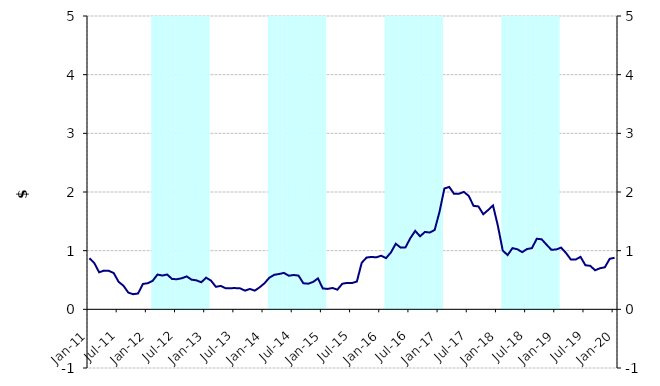
| Category | Series 1 |
|---|---|
| 0 | 0 |
| 1900-01-01 | 0 |
| 1900-01-02 | 0 |
| 1900-01-03 | 0 |
| 1900-01-04 | 0 |
| 1900-01-05 | 0 |
| 1900-01-06 | 0 |
| 1900-01-07 | 0 |
| 1900-01-08 | 0 |
| 1900-01-09 | 0 |
| 1900-01-10 | 0 |
| 1900-01-11 | 0 |
| 1900-01-12 | 0 |
| 1900-01-13 | 5000000 |
| 1900-01-14 | 5000000 |
| 1900-01-15 | 5000000 |
| 1900-01-16 | 5000000 |
| 1900-01-17 | 5000000 |
| 1900-01-18 | 5000000 |
| 1900-01-19 | 5000000 |
| 1900-01-20 | 5000000 |
| 1900-01-21 | 5000000 |
| 1900-01-22 | 5000000 |
| 1900-01-23 | 5000000 |
| 1900-01-24 | 5000000 |
| 1900-01-25 | 0 |
| 1900-01-26 | 0 |
| 1900-01-27 | 0 |
| 1900-01-28 | 0 |
| 1900-01-29 | 0 |
| 1900-01-30 | 0 |
| 1900-01-31 | 0 |
| 1900-02-01 | 0 |
| 1900-02-02 | 0 |
| 1900-02-03 | 0 |
| 1900-02-04 | 0 |
| 1900-02-05 | 0 |
| 1900-02-06 | 5000000 |
| 1900-02-07 | 5000000 |
| 1900-02-08 | 5000000 |
| 1900-02-09 | 5000000 |
| 1900-02-10 | 5000000 |
| 1900-02-11 | 5000000 |
| 1900-02-12 | 5000000 |
| 1900-02-13 | 5000000 |
| 1900-02-14 | 5000000 |
| 1900-02-15 | 5000000 |
| 1900-02-16 | 5000000 |
| 1900-02-17 | 5000000 |
| 1900-02-18 | 0 |
| 1900-02-19 | 0 |
| 1900-02-20 | 0 |
| 1900-02-21 | 0 |
| 1900-02-22 | 0 |
| 1900-02-23 | 0 |
| 1900-02-24 | 0 |
| 1900-02-25 | 0 |
| 1900-02-26 | 0 |
| 1900-02-27 | 0 |
| 1900-02-28 | 0 |
| 1900-02-28 | 0 |
| 1900-03-01 | 5000000 |
| 1900-03-02 | 5000000 |
| 1900-03-03 | 5000000 |
| 1900-03-04 | 5000000 |
| 1900-03-05 | 5000000 |
| 1900-03-06 | 5000000 |
| 1900-03-07 | 5000000 |
| 1900-03-08 | 5000000 |
| 1900-03-09 | 5000000 |
| 1900-03-10 | 5000000 |
| 1900-03-11 | 5000000 |
| 1900-03-12 | 5000000 |
| 1900-03-13 | 0 |
| 1900-03-14 | 0 |
| 1900-03-15 | 0 |
| 1900-03-16 | 0 |
| 1900-03-17 | 0 |
| 1900-03-18 | 0 |
| 1900-03-19 | 0 |
| 1900-03-20 | 0 |
| 1900-03-21 | 0 |
| 1900-03-22 | 0 |
| 1900-03-23 | 0 |
| 1900-03-24 | 0 |
| 1900-03-25 | 5000000 |
| 1900-03-26 | 5000000 |
| 1900-03-27 | 5000000 |
| 1900-03-28 | 5000000 |
| 1900-03-29 | 5000000 |
| 1900-03-30 | 5000000 |
| 1900-03-31 | 5000000 |
| 1900-04-01 | 5000000 |
| 1900-04-02 | 5000000 |
| 1900-04-03 | 5000000 |
| 1900-04-04 | 5000000 |
| 1900-04-05 | 5000000 |
| 1900-04-06 | 0 |
| 1900-04-07 | 0 |
| 1900-04-08 | 0 |
| 1900-04-09 | 0 |
| 1900-04-10 | 0 |
| 1900-04-11 | 0 |
| 1900-04-12 | 0 |
| 1900-04-13 | 0 |
| 1900-04-14 | 0 |
| 1900-04-15 | 0 |
| 1900-04-16 | 0 |
| 1900-04-17 | 0 |